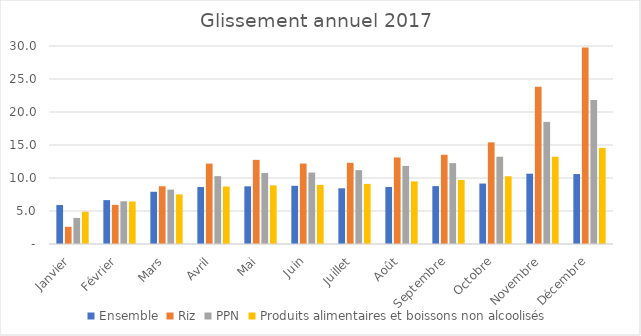
| Category |  Ensemble  |  Riz  |  PPN  |  Produits alimentaires et boissons non alcoolisés  |
|---|---|---|---|---|
| Janvier | 5.902 | 2.606 | 3.95 | 4.895 |
| Février | 6.647 | 5.931 | 6.474 | 6.44 |
| Mars | 7.913 | 8.749 | 8.239 | 7.516 |
| Avril | 8.631 | 12.183 | 10.287 | 8.712 |
| Mai | 8.738 | 12.747 | 10.773 | 8.89 |
| Juin | 8.817 | 12.189 | 10.82 | 8.96 |
| Juillet | 8.442 | 12.307 | 11.189 | 9.107 |
| Août | 8.637 | 13.111 | 11.827 | 9.485 |
| Septembre | 8.771 | 13.519 | 12.255 | 9.696 |
| Octobre | 9.159 | 15.398 | 13.223 | 10.263 |
| Novembre | 10.653 | 23.831 | 18.503 | 13.221 |
| Décembre | 10.598 | 29.783 | 21.822 | 14.562 |